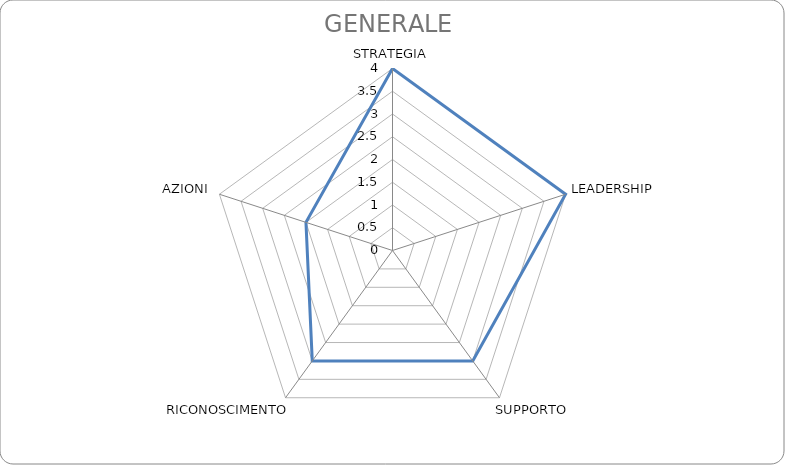
| Category | Series 0 |
|---|---|
| STRATEGIA | 4 |
| LEADERSHIP | 4 |
| SUPPORTO | 3 |
| RICONOSCIMENTO | 3 |
| AZIONI | 2 |